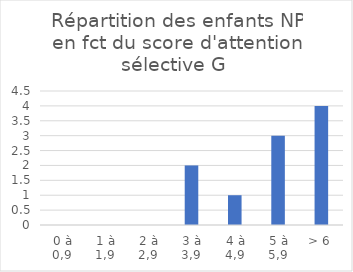
| Category | Series 0 |
|---|---|
| 0 à 0,9 | 0 |
| 1 à 1,9 | 0 |
| 2 à 2,9 | 0 |
| 3 à 3,9 | 2 |
| 4 à 4,9 | 1 |
| 5 à 5,9 | 3 |
| > 6 | 4 |